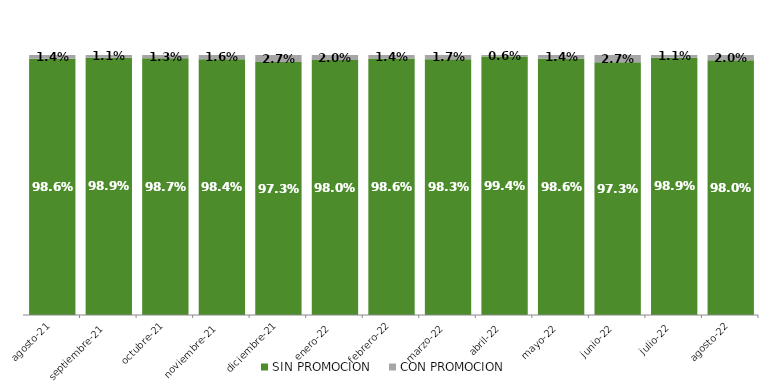
| Category | SIN PROMOCION   | CON PROMOCION   |
|---|---|---|
| 2021-08-01 | 0.986 | 0.014 |
| 2021-09-01 | 0.989 | 0.011 |
| 2021-10-01 | 0.987 | 0.013 |
| 2021-11-01 | 0.984 | 0.016 |
| 2021-12-01 | 0.973 | 0.027 |
| 2022-01-01 | 0.98 | 0.02 |
| 2022-02-01 | 0.986 | 0.014 |
| 2022-03-01 | 0.983 | 0.017 |
| 2022-04-01 | 0.994 | 0.006 |
| 2022-05-01 | 0.986 | 0.014 |
| 2022-06-01 | 0.973 | 0.027 |
| 2022-07-01 | 0.989 | 0.011 |
| 2022-08-01 | 0.98 | 0.02 |